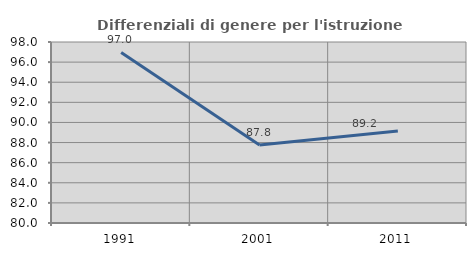
| Category | Differenziali di genere per l'istruzione superiore |
|---|---|
| 1991.0 | 96.956 |
| 2001.0 | 87.766 |
| 2011.0 | 89.16 |